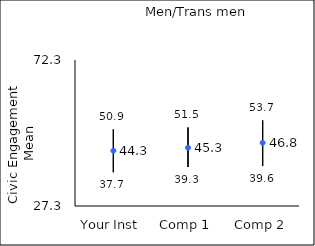
| Category | 25th percentile | 75th percentile | Mean |
|---|---|---|---|
| Your Inst | 37.7 | 50.9 | 44.33 |
| Comp 1 | 39.3 | 51.5 | 45.25 |
| Comp 2 | 39.6 | 53.7 | 46.78 |